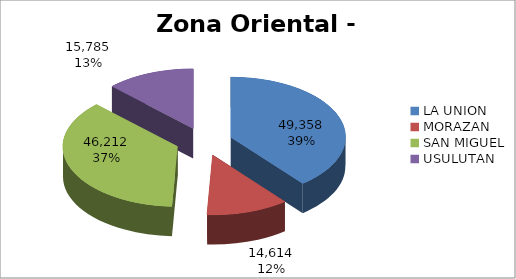
| Category | Series 0 |
|---|---|
| LA UNION | 49358 |
| MORAZAN | 14614 |
| SAN MIGUEL | 46212 |
| USULUTAN | 15785 |